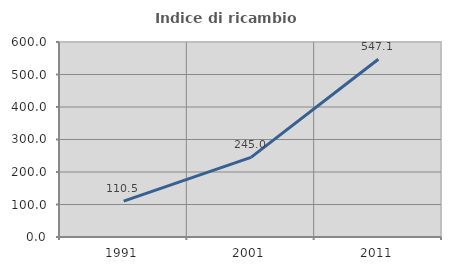
| Category | Indice di ricambio occupazionale  |
|---|---|
| 1991.0 | 110.526 |
| 2001.0 | 245 |
| 2011.0 | 547.059 |